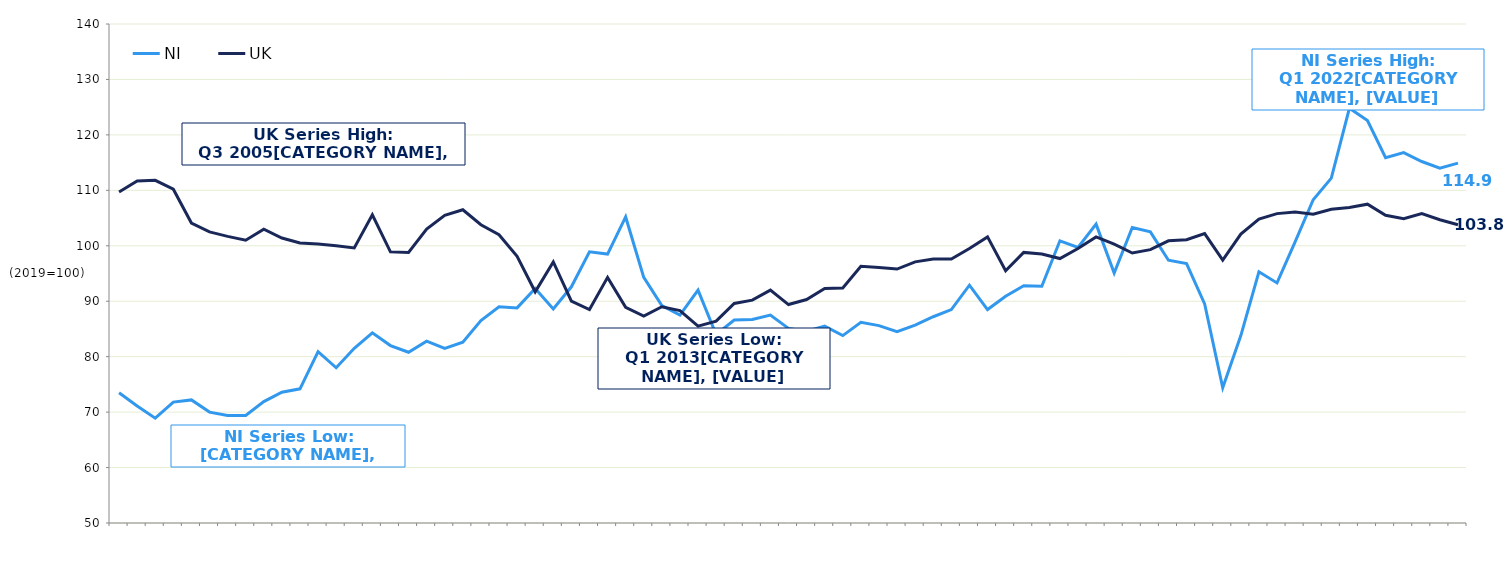
| Category | NI | UK  |
|---|---|---|
|  | 73.5 | 109.7 |
|  | 71.1 | 111.7 |
| Q3 2005 | 68.9 | 111.8 |
|  | 71.8 | 110.2 |
|  | 72.2 | 104.1 |
|  | 70 | 102.5 |
| Q3 2006 | 69.4 | 101.7 |
|  | 69.4 | 101 |
|  | 71.9 | 103 |
|  | 73.6 | 101.4 |
| Q3 2007 | 74.2 | 100.5 |
|  | 80.9 | 100.3 |
|  | 78 | 100 |
|  | 81.5 | 99.6 |
| Q3 2008 | 84.3 | 105.6 |
|  | 82 | 98.9 |
|  | 80.8 | 98.8 |
|  | 82.8 | 103 |
| Q3 2009 | 81.5 | 105.5 |
|  | 82.6 | 106.5 |
|  | 86.5 | 103.8 |
|  | 89 | 102 |
| Q3 2010 | 88.8 | 98.1 |
|  | 92.3 | 91.7 |
|  | 88.6 | 97.1 |
|  | 92.6 | 90 |
| Q3 2011 | 98.9 | 88.5 |
|  | 98.5 | 94.3 |
|  | 105.2 | 88.9 |
|  | 94.3 | 87.3 |
| Q3 2012 | 89.2 | 89 |
|  | 87.5 | 88.3 |
|  | 92 | 85.5 |
|  | 84 | 86.4 |
| Q3 2013 | 86.6 | 89.6 |
|  | 86.7 | 90.2 |
|  | 87.5 | 92 |
|  | 85.1 | 89.4 |
| Q3 2014 | 84.6 | 90.3 |
|  | 85.5 | 92.3 |
|  | 83.8 | 92.4 |
|  | 86.2 | 96.3 |
| Q3 2015 | 85.6 | 96.1 |
|  | 84.5 | 95.8 |
|  | 85.7 | 97.1 |
|  | 87.2 | 97.6 |
| Q3 2016 | 88.5 | 97.6 |
|  | 92.9 | 99.5 |
|  | 88.5 | 101.6 |
|  | 90.9 | 95.5 |
| Q3 2017 | 92.8 | 98.8 |
|  | 92.7 | 98.5 |
|  | 100.9 | 97.7 |
|  | 99.7 | 99.5 |
| Q3 2018 | 103.9 | 101.6 |
|  | 95.1 | 100.3 |
|  | 103.3 | 98.7 |
|  | 102.5 | 99.3 |
| Q3 2019 | 97.4 | 100.9 |
|  | 96.8 | 101.1 |
|  | 89.5 | 102.2 |
|  | 74.4 | 97.4 |
| Q3 2020 | 83.8 | 102.1 |
|  | 95.3 | 104.8 |
|  | 93.3 | 105.8 |
|  | 100.7 | 106.1 |
| Q3 2021 | 108.3 | 105.7 |
|  | 112.2 | 106.6 |
|  | 124.8 | 106.9 |
|  | 122.6 | 107.5 |
| Q3 2022 | 115.9 | 105.5 |
|  | 116.8 | 104.9 |
|  | 115.2 | 105.8 |
|  | 114 | 104.7 |
| Q3 2023 | 114.9 | 103.8 |